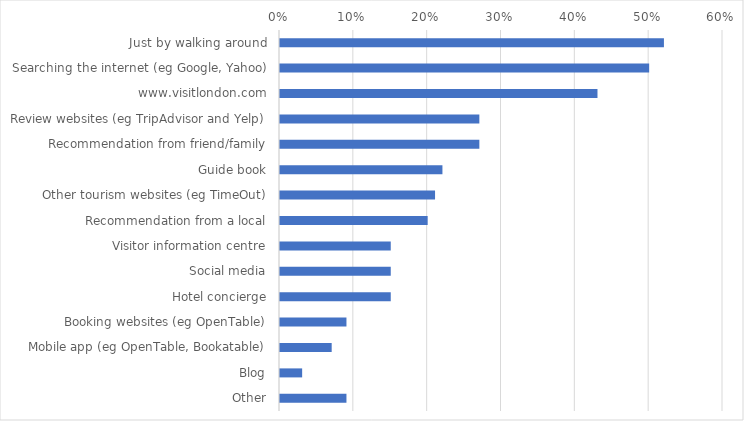
| Category | Percent |
|---|---|
| Just by walking around | 0.52 |
| Searching the internet (eg Google, Yahoo) | 0.5 |
| www.visitlondon.com | 0.43 |
| Review websites (eg TripAdvisor and Yelp) | 0.27 |
| Recommendation from friend/family | 0.27 |
| Guide book | 0.22 |
| Other tourism websites (eg TimeOut) | 0.21 |
| Recommendation from a local | 0.2 |
| Visitor information centre | 0.15 |
| Social media | 0.15 |
| Hotel concierge | 0.15 |
| Booking websites (eg OpenTable) | 0.09 |
| Mobile app (eg OpenTable, Bookatable) | 0.07 |
| Blog | 0.03 |
| Other | 0.09 |